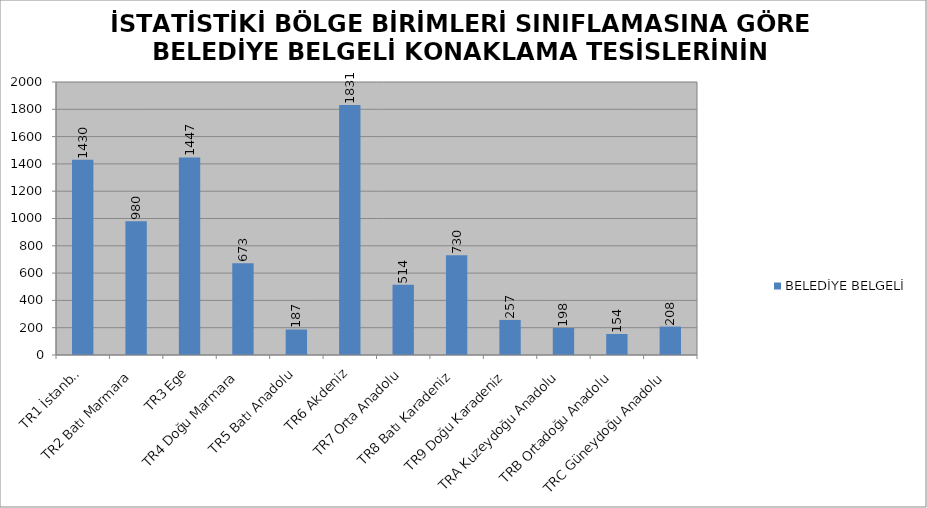
| Category | BELEDİYE BELGELİ |
|---|---|
| TR1 İstanbul | 1430 |
| TR2 Batı Marmara | 980 |
| TR3 Ege | 1447 |
| TR4 Doğu Marmara | 673 |
| TR5 Batı Anadolu | 187 |
| TR6 Akdeniz | 1831 |
| TR7 Orta Anadolu | 514 |
| TR8 Batı Karadeniz | 730 |
| TR9 Doğu Karadeniz | 257 |
| TRA Kuzeydoğu Anadolu | 198 |
| TRB Ortadoğu Anadolu | 154 |
| TRC Güneydoğu Anadolu | 208 |